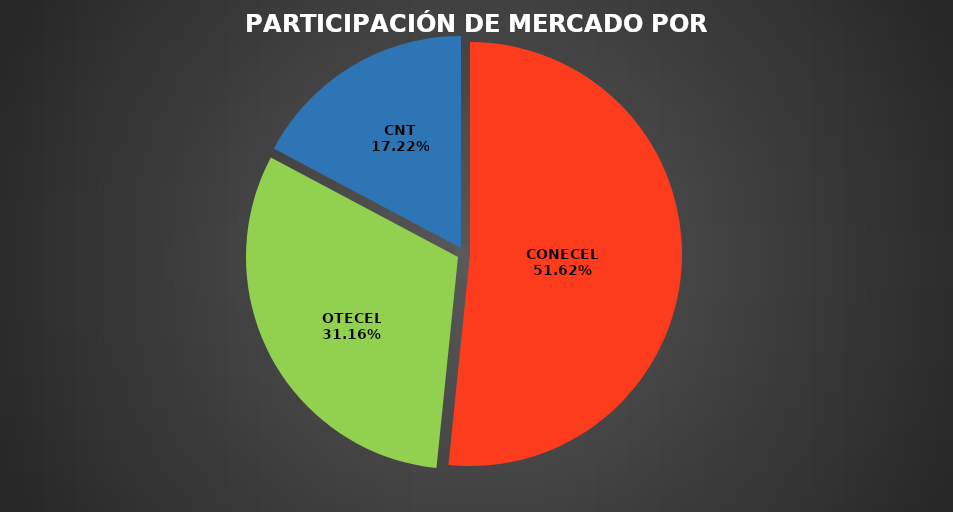
| Category | Ago 2022 |
|---|---|
| CONECEL | 8855909 |
| OTECEL | 5345771 |
| CNT | 2954002 |